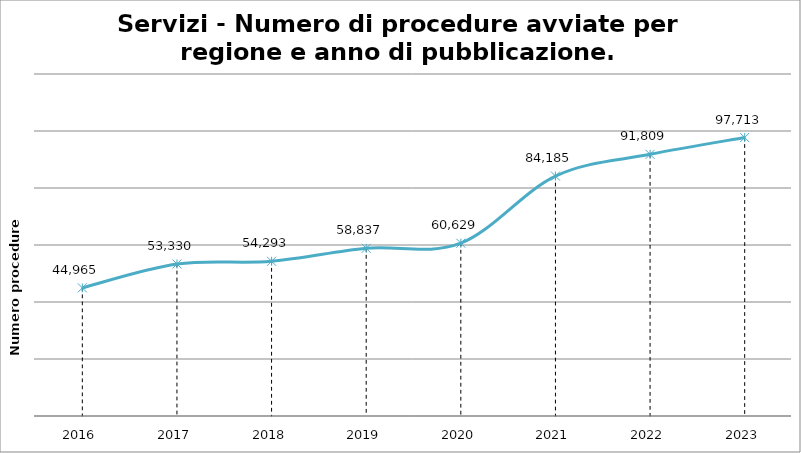
| Category | Totale |
|---|---|
| 2016.0 | 44965 |
| 2017.0 | 53330 |
| 2018.0 | 54293 |
| 2019.0 | 58837 |
| 2020.0 | 60629 |
| 2021.0 | 84185 |
| 2022.0 | 91809 |
| 2023.0 | 97713 |